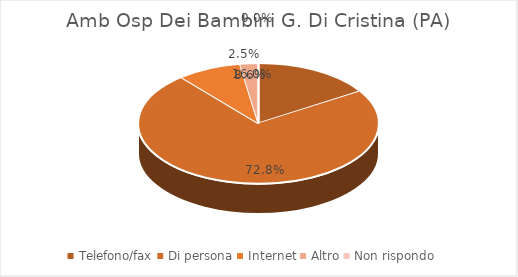
| Category | Amb Osp Dei Bambini G. Di Cristina (PA) |
|---|---|
| Telefono/fax | 0.16 |
| Di persona | 0.728 |
| Internet | 0.086 |
| Altro | 0.025 |
| Non rispondo | 0 |